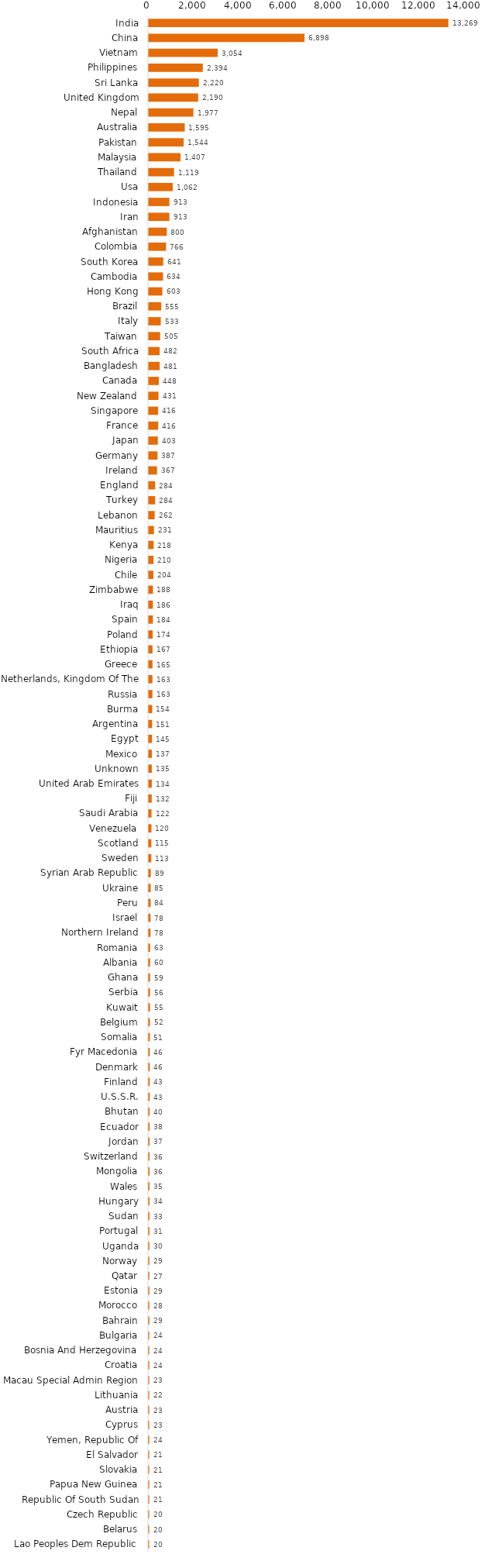
| Category | Series 0 |
|---|---|
| India | 13269 |
| China | 6898 |
| Vietnam | 3054 |
| Philippines | 2394 |
| Sri Lanka | 2220 |
| United Kingdom | 2190 |
| Nepal | 1977 |
| Australia | 1595 |
| Pakistan | 1544 |
| Malaysia | 1407 |
| Thailand | 1119 |
| Usa | 1062 |
| Indonesia | 913 |
| Iran | 913 |
| Afghanistan | 800 |
| Colombia | 766 |
| South Korea | 641 |
| Cambodia | 634 |
| Hong Kong | 603 |
| Brazil | 555 |
| Italy | 533 |
| Taiwan | 505 |
| South Africa | 482 |
| Bangladesh | 481 |
| Canada | 448 |
| New Zealand | 431 |
| Singapore | 416 |
| France | 416 |
| Japan | 403 |
| Germany | 387 |
| Ireland | 367 |
| England | 284 |
| Turkey | 284 |
| Lebanon | 262 |
| Mauritius | 231 |
| Kenya | 218 |
| Nigeria | 210 |
| Chile | 204 |
| Zimbabwe | 188 |
| Iraq | 186 |
| Spain | 184 |
| Poland | 174 |
| Ethiopia | 167 |
| Greece | 165 |
| Netherlands, Kingdom Of The | 163 |
| Russia | 163 |
| Burma | 154 |
| Argentina | 151 |
| Egypt | 145 |
| Mexico | 137 |
| Unknown | 135 |
| United Arab Emirates | 134 |
| Fiji | 132 |
| Saudi Arabia | 122 |
| Venezuela | 120 |
| Scotland | 115 |
| Sweden | 113 |
| Syrian Arab Republic | 89 |
| Ukraine | 85 |
| Peru | 84 |
| Israel | 78 |
| Northern Ireland | 78 |
| Romania | 63 |
| Albania | 60 |
| Ghana | 59 |
| Serbia | 56 |
| Kuwait | 55 |
| Belgium | 52 |
| Somalia | 51 |
| Fyr Macedonia | 46 |
| Denmark | 46 |
| Finland | 43 |
| U.S.S.R. | 43 |
| Bhutan | 40 |
| Ecuador | 38 |
| Jordan | 37 |
| Switzerland | 36 |
| Mongolia | 36 |
| Wales | 35 |
| Hungary | 34 |
| Sudan | 33 |
| Portugal | 31 |
| Uganda | 30 |
| Norway | 29 |
| Qatar | 27 |
| Estonia | 29 |
| Morocco | 28 |
| Bahrain | 29 |
| Bulgaria | 24 |
| Bosnia And Herzegovina | 24 |
| Croatia | 24 |
| Macau Special Admin Region | 23 |
| Lithuania | 22 |
| Austria | 23 |
| Cyprus | 23 |
| Yemen, Republic Of | 24 |
| El Salvador | 21 |
| Slovakia | 21 |
| Papua New Guinea | 21 |
| Republic Of South Sudan | 21 |
| Czech Republic | 20 |
| Belarus | 20 |
| Lao Peoples Dem Republic | 20 |